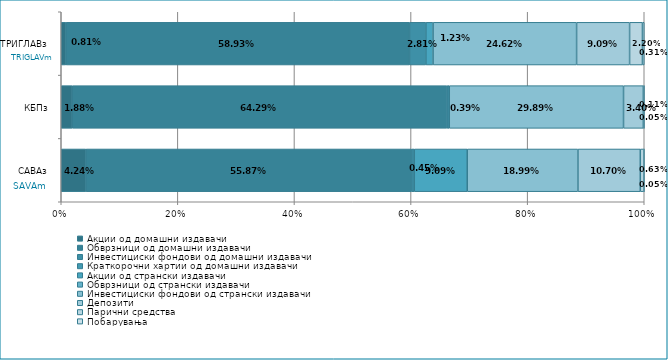
| Category | Акции од домашни издавачи  | Обврзници од домашни издавачи  | Инвестициски фондови од домашни издавачи  | Краткорочни хартии од домашни издавачи  | Акции од странски издавачи  | Обврзници од странски издавачи  | Инвестициски фондови од странски издавaчи | Депозити  | Парични средства  | Побарувања |
|---|---|---|---|---|---|---|---|---|---|---|
| САВАз | 0.042 | 0.559 | 0.004 | 0 | 0.091 | 0 | 0.19 | 0.107 | 0.006 | 0 |
| КБПз | 0.019 | 0.643 | 0.004 | 0 | 0 | 0 | 0.299 | 0.034 | 0.001 | 0 |
| ТРИГЛАВз | 0.008 | 0.589 | 0.028 | 0 | 0.012 | 0 | 0.246 | 0.091 | 0.022 | 0.003 |